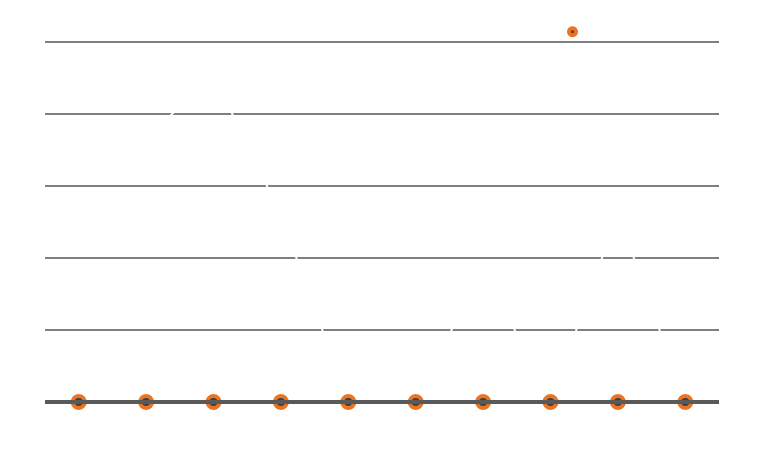
| Category | Millas conducidas |
|---|---|
| 5/1/12 | 162 |
| 5/2/12 | 183 |
| 5/3/12 | 227 |
| 5/4/12 | 130 |
| 5/5/12 | 0 |
| 5/6/12 | 0 |
| 5/7/12 | 94 |
| 5/8/12 | 0 |
| 5/9/12 | 131 |
| 5/10/12 | 0 |